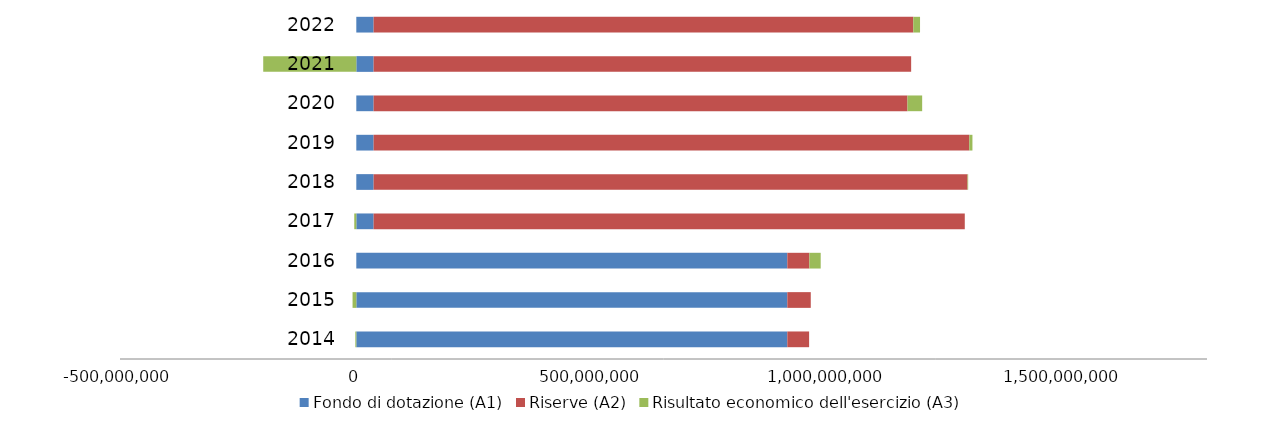
| Category | Fondo di dotazione (A1) | Riserve (A2) | Risultato economico dell'esercizio (A3) |
|---|---|---|---|
| 2014.0 | 911975231.76 | 46143920.59 | -2054764.56 |
| 2015.0 | 911975231.76 | 49631236.83 | -7942214.91 |
| 2016.0 | 911975231.76 | 46663404.52 | 23977025.01 |
| 2017.0 | 36643864.83 | 1250848075.62 | -4337131.1 |
| 2018.0 | 36643864.83 | 1256677071.49 | 1328767.48 |
| 2019.0 | 36643864.83 | 1260411527.71 | 6637059.97 |
| 2020.0 | 36643864.83 | 1129587369.35 | 31096788.31 |
| 2021.0 | 36643864.83 | 1137374324.41 | -196940879.86 |
| 2022.0 | 36643864.83 | 1141918395.61 | 14252095.3 |